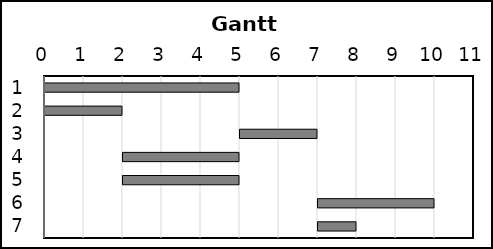
| Category | Series 0 | Series 1 |
|---|---|---|
| 0 | 0 | 5 |
| 1 | 0 | 2 |
| 2 | 5 | 2 |
| 3 | 2 | 3 |
| 4 | 2 | 3 |
| 5 | 7 | 3 |
| 6 | 7 | 1 |